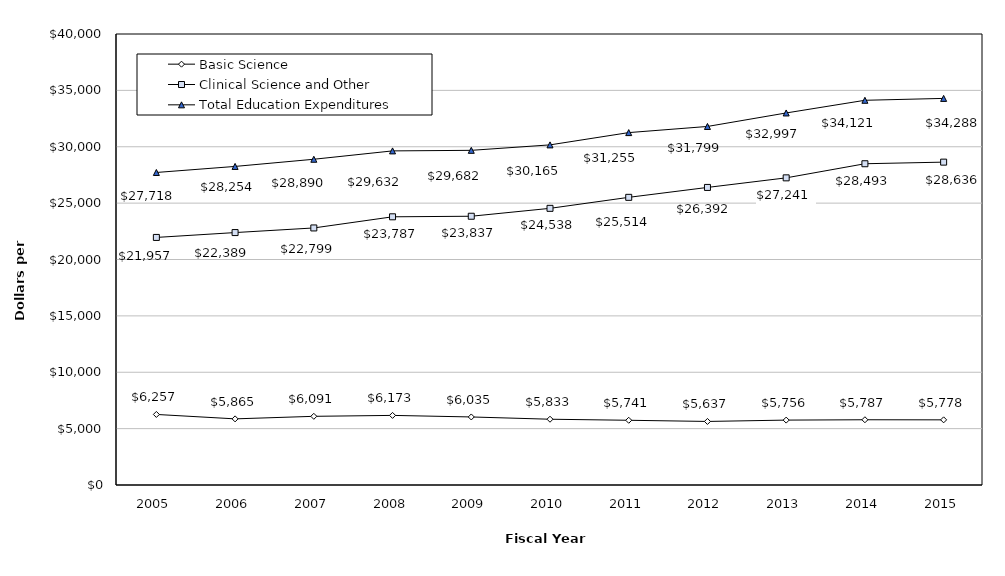
| Category | Basic Science | Clinical Science and Other | Total Education Expenditures |
|---|---|---|---|
| 2005.0 | 6257 | 21957 | 27718 |
| 2006.0 | 5865 | 22389 | 28254 |
| 2007.0 | 6091 | 22799 | 28890 |
| 2008.0 | 6173 | 23787 | 29632 |
| 2009.0 | 6035 | 23837 | 29682 |
| 2010.0 | 5833 | 24538 | 30165 |
| 2011.0 | 5741 | 25514 | 31255 |
| 2012.0 | 5637 | 26392 | 31799 |
| 2013.0 | 5756 | 27241 | 32997 |
| 2014.0 | 5787 | 28493 | 34121 |
| 2015.0 | 5778 | 28636 | 34288 |